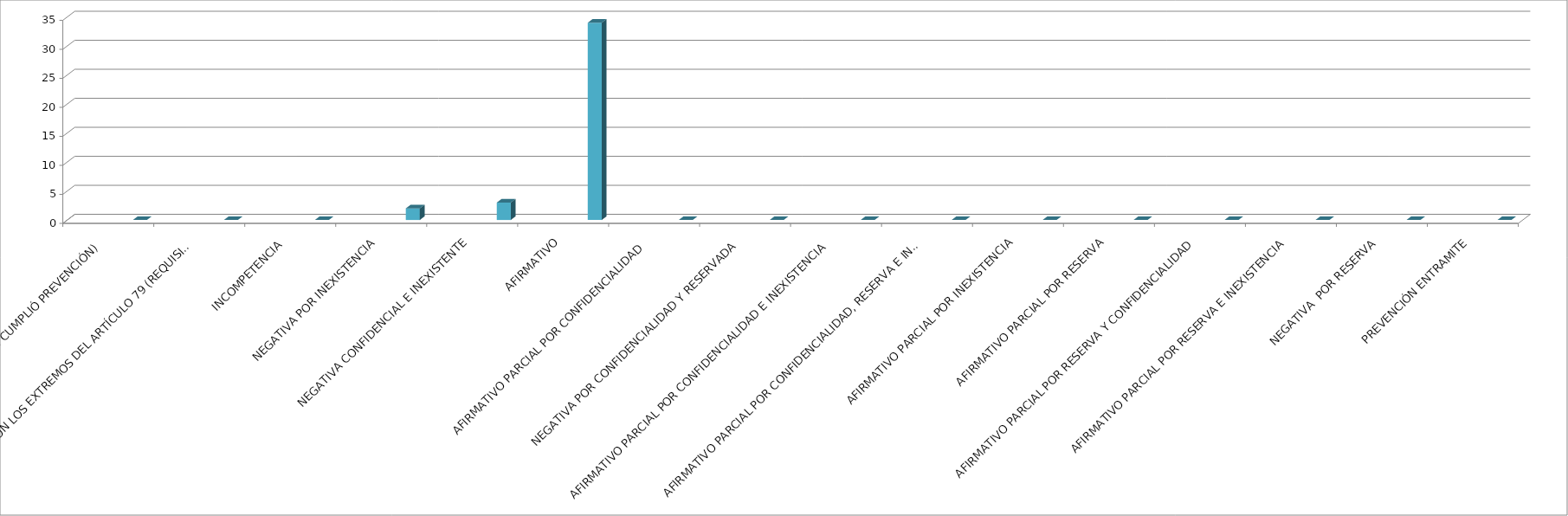
| Category | Series 0 | Series 1 | Series 2 | Series 3 | Series 4 |
|---|---|---|---|---|---|
| SE TIENE POR NO PRESENTADA ( NO CUMPLIÓ PREVENCIÓN) |  |  |  |  | 0 |
| NO CUMPLIO CON LOS EXTREMOS DEL ARTÍCULO 79 (REQUISITOS) |  |  |  |  | 0 |
| INCOMPETENCIA  |  |  |  |  | 0 |
| NEGATIVA POR INEXISTENCIA |  |  |  |  | 2 |
| NEGATIVA CONFIDENCIAL E INEXISTENTE |  |  |  |  | 3 |
| AFIRMATIVO |  |  |  |  | 34 |
| AFIRMATIVO PARCIAL POR CONFIDENCIALIDAD  |  |  |  |  | 0 |
| NEGATIVA POR CONFIDENCIALIDAD Y RESERVADA |  |  |  |  | 0 |
| AFIRMATIVO PARCIAL POR CONFIDENCIALIDAD E INEXISTENCIA |  |  |  |  | 0 |
| AFIRMATIVO PARCIAL POR CONFIDENCIALIDAD, RESERVA E INEXISTENCIA |  |  |  |  | 0 |
| AFIRMATIVO PARCIAL POR INEXISTENCIA |  |  |  |  | 0 |
| AFIRMATIVO PARCIAL POR RESERVA |  |  |  |  | 0 |
| AFIRMATIVO PARCIAL POR RESERVA Y CONFIDENCIALIDAD |  |  |  |  | 0 |
| AFIRMATIVO PARCIAL POR RESERVA E INEXISTENCIA |  |  |  |  | 0 |
| NEGATIVA  POR RESERVA |  |  |  |  | 0 |
| PREVENCIÓN ENTRAMITE |  |  |  |  | 0 |